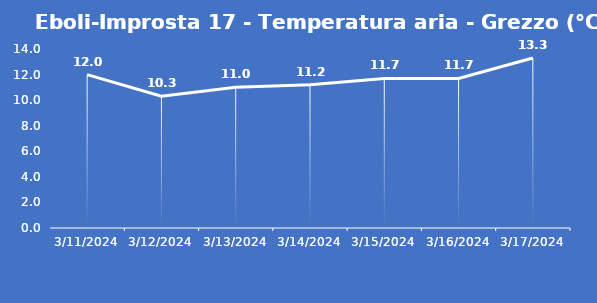
| Category | Eboli-Improsta 17 - Temperatura aria - Grezzo (°C) |
|---|---|
| 3/11/24 | 12 |
| 3/12/24 | 10.3 |
| 3/13/24 | 11 |
| 3/14/24 | 11.2 |
| 3/15/24 | 11.7 |
| 3/16/24 | 11.7 |
| 3/17/24 | 13.3 |